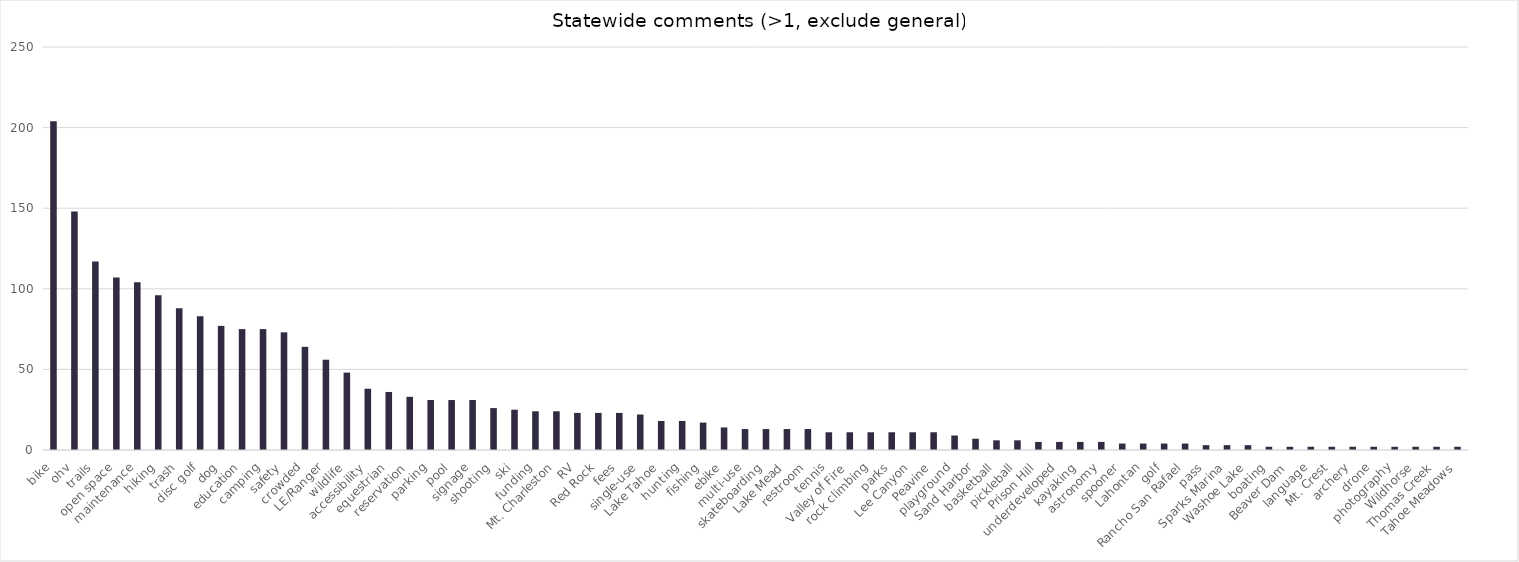
| Category | Count |
|---|---|
| bike | 204 |
| ohv | 148 |
| trails | 117 |
| open space | 107 |
| maintenance | 104 |
| hiking | 96 |
| trash | 88 |
| disc golf | 83 |
| dog | 77 |
| education | 75 |
| camping | 75 |
| safety | 73 |
| crowded | 64 |
| LE/Ranger | 56 |
| wildlife | 48 |
| accessibility | 38 |
| equestrian | 36 |
| reservation | 33 |
| parking | 31 |
| pool | 31 |
| signage | 31 |
| shooting | 26 |
| ski | 25 |
| funding | 24 |
| Mt. Charleston | 24 |
| RV | 23 |
| Red Rock | 23 |
| fees | 23 |
| single-use | 22 |
| Lake Tahoe | 18 |
| hunting | 18 |
| fishing | 17 |
| ebike | 14 |
| multi-use | 13 |
| skateboarding | 13 |
| Lake Mead | 13 |
| restroom | 13 |
| tennis | 11 |
| Valley of Fire | 11 |
| rock climbing | 11 |
| parks | 11 |
| Lee Canyon | 11 |
| Peavine | 11 |
| playground | 9 |
| Sand Harbor | 7 |
| basketball | 6 |
| pickleball | 6 |
| Prison Hill | 5 |
| underdeveloped | 5 |
| kayaking | 5 |
| astronomy | 5 |
| spooner | 4 |
| Lahontan | 4 |
| golf | 4 |
| Rancho San Rafael | 4 |
| pass | 3 |
| Sparks Marina | 3 |
| Washoe Lake | 3 |
| boating | 2 |
| Beaver Dam | 2 |
| language | 2 |
| Mt. Crest | 2 |
| archery | 2 |
| drone | 2 |
| photography | 2 |
| Wildhorse | 2 |
| Thomas Creek | 2 |
| Tahoe Meadows | 2 |